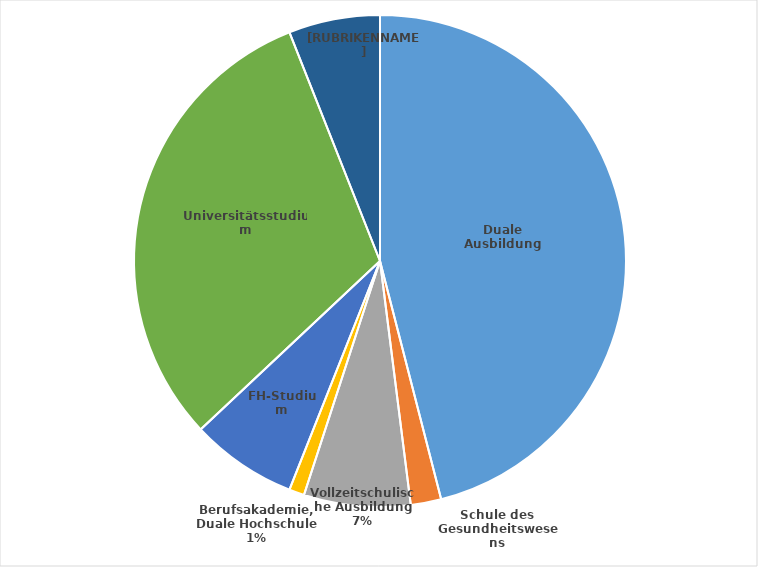
| Category | Series 0 |
|---|---|
| Duale Ausbildung | 46 |
| Schule des Gesundheitswesens | 2 |
| Vollzeitschulische Ausbildung | 7 |
| Berufsakademie, Duale Hochschule | 1 |
| FH-Studium | 7 |
| Universitätsstudium | 31 |
| Sonstige Ausbildung | 6 |